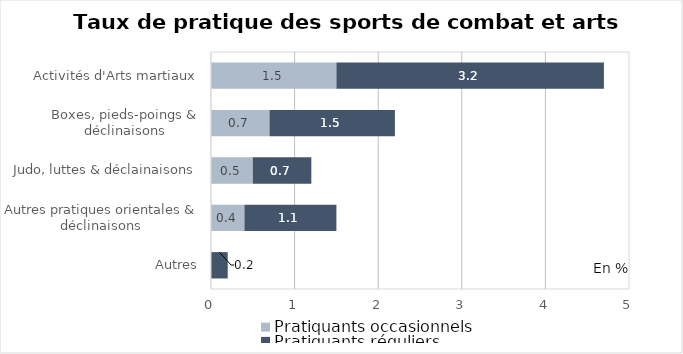
| Category | Pratiquants occasionnels | Pratiquants réguliers |
|---|---|---|
| Autres | 0 | 0.2 |
| Autres pratiques orientales & déclinaisons | 0.4 | 1.1 |
| Judo, luttes & déclainaisons | 0.5 | 0.7 |
| Boxes, pieds-poings & déclinaisons | 0.7 | 1.5 |
| Activités d'Arts martiaux | 1.5 | 3.2 |